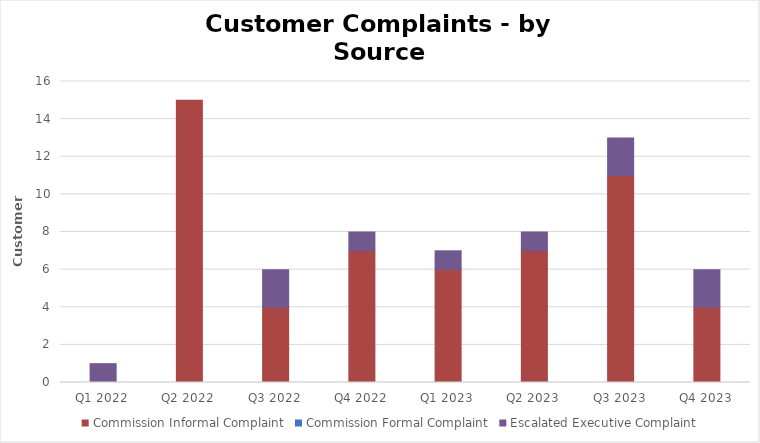
| Category | Commission Informal Complaint | Commission Formal Complaint | Escalated Executive Complaint |
|---|---|---|---|
| Q1 2022 | 0 | 0 | 1 |
| Q2 2022 | 15 | 0 | 0 |
| Q3 2022 | 4 | 0 | 2 |
| Q4 2022 | 7 | 0 | 1 |
| Q1 2023 | 6 | 0 | 1 |
| Q2 2023 | 7 | 0 | 1 |
| Q3 2023 | 11 | 0 | 2 |
| Q4 2023 | 4 | 0 | 2 |